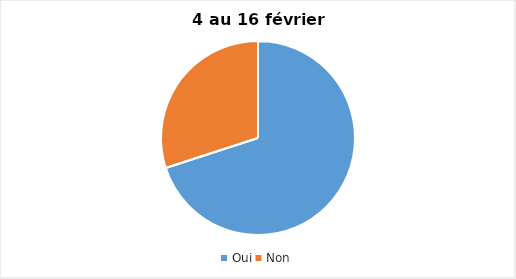
| Category | Series 0 |
|---|---|
| Oui | 70 |
| Non | 30 |